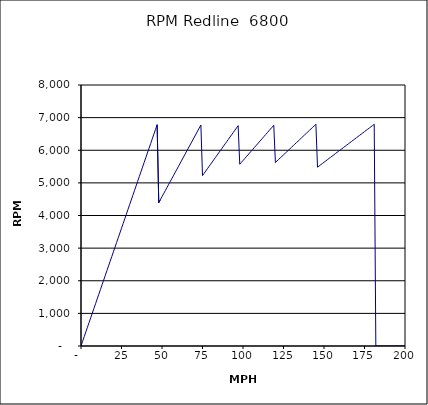
| Category | RPM Redline  6800 |
|---|---|
| 0.0 | 0 |
| 1.0 | 144.311 |
| 2.0 | 288.622 |
| 3.0 | 432.933 |
| 4.0 | 577.244 |
| 5.0 | 721.555 |
| 6.0 | 865.865 |
| 7.0 | 1010.176 |
| 8.0 | 1154.487 |
| 9.0 | 1298.798 |
| 10.0 | 1443.109 |
| 11.0 | 1587.42 |
| 12.0 | 1731.731 |
| 13.0 | 1876.042 |
| 14.0 | 2020.353 |
| 15.0 | 2164.664 |
| 16.0 | 2308.974 |
| 17.0 | 2453.285 |
| 18.0 | 2597.596 |
| 19.0 | 2741.907 |
| 20.0 | 2886.218 |
| 21.0 | 3030.529 |
| 22.0 | 3174.84 |
| 23.0 | 3319.151 |
| 24.0 | 3463.462 |
| 25.0 | 3607.773 |
| 26.0 | 3752.084 |
| 27.0 | 3896.394 |
| 28.0 | 4040.705 |
| 29.0 | 4185.016 |
| 30.0 | 4329.327 |
| 31.0 | 4473.638 |
| 32.0 | 4617.949 |
| 33.0 | 4762.26 |
| 34.0 | 4906.571 |
| 35.0 | 5050.882 |
| 36.0 | 5195.193 |
| 37.0 | 5339.503 |
| 38.0 | 5483.814 |
| 39.0 | 5628.125 |
| 40.0 | 5772.436 |
| 41.0 | 5916.747 |
| 42.0 | 6061.058 |
| 43.0 | 6205.369 |
| 44.0 | 6349.68 |
| 45.0 | 6493.991 |
| 46.0 | 6638.302 |
| 47.0 | 6782.613 |
| 48.0 | 4392.683 |
| 49.0 | 4484.197 |
| 50.0 | 4575.712 |
| 51.0 | 4667.226 |
| 52.0 | 4758.74 |
| 53.0 | 4850.254 |
| 54.0 | 4941.769 |
| 55.0 | 5033.283 |
| 56.0 | 5124.797 |
| 57.0 | 5216.311 |
| 58.0 | 5307.825 |
| 59.0 | 5399.34 |
| 60.0 | 5490.854 |
| 61.0 | 5582.368 |
| 62.0 | 5673.882 |
| 63.0 | 5765.397 |
| 64.0 | 5856.911 |
| 65.0 | 5948.425 |
| 66.0 | 6039.939 |
| 67.0 | 6131.454 |
| 68.0 | 6222.968 |
| 69.0 | 6314.482 |
| 70.0 | 6405.996 |
| 71.0 | 6497.511 |
| 72.0 | 6589.025 |
| 73.0 | 6680.539 |
| 74.0 | 6772.053 |
| 75.0 | 5222.28 |
| 76.0 | 5291.91 |
| 77.0 | 5361.54 |
| 78.0 | 5431.171 |
| 79.0 | 5500.801 |
| 80.0 | 5570.432 |
| 81.0 | 5640.062 |
| 82.0 | 5709.692 |
| 83.0 | 5779.323 |
| 84.0 | 5848.953 |
| 85.0 | 5918.584 |
| 86.0 | 5988.214 |
| 87.0 | 6057.844 |
| 88.0 | 6127.475 |
| 89.0 | 6197.105 |
| 90.0 | 6266.735 |
| 91.0 | 6336.366 |
| 92.0 | 6405.996 |
| 93.0 | 6475.627 |
| 94.0 | 6545.257 |
| 95.0 | 6614.887 |
| 96.0 | 6684.518 |
| 97.0 | 6754.148 |
| 98.0 | 5571.276 |
| 99.0 | 5628.125 |
| 100.0 | 5684.975 |
| 101.0 | 5741.825 |
| 102.0 | 5798.675 |
| 103.0 | 5855.524 |
| 104.0 | 5912.374 |
| 105.0 | 5969.224 |
| 106.0 | 6026.074 |
| 107.0 | 6082.923 |
| 108.0 | 6139.773 |
| 109.0 | 6196.623 |
| 110.0 | 6253.473 |
| 111.0 | 6310.322 |
| 112.0 | 6367.172 |
| 113.0 | 6424.022 |
| 114.0 | 6480.872 |
| 115.0 | 6537.721 |
| 116.0 | 6594.571 |
| 117.0 | 6651.421 |
| 118.0 | 6708.271 |
| 119.0 | 6765.12 |
| 120.0 | 5624.777 |
| 121.0 | 5671.65 |
| 122.0 | 5718.524 |
| 123.0 | 5765.397 |
| 124.0 | 5812.27 |
| 125.0 | 5859.143 |
| 126.0 | 5906.016 |
| 127.0 | 5952.889 |
| 128.0 | 5999.762 |
| 129.0 | 6046.636 |
| 130.0 | 6093.509 |
| 131.0 | 6140.382 |
| 132.0 | 6187.255 |
| 133.0 | 6234.128 |
| 134.0 | 6281.001 |
| 135.0 | 6327.874 |
| 136.0 | 6374.748 |
| 137.0 | 6421.621 |
| 138.0 | 6468.494 |
| 139.0 | 6515.367 |
| 140.0 | 6562.24 |
| 141.0 | 6609.113 |
| 142.0 | 6655.986 |
| 143.0 | 6702.86 |
| 144.0 | 6749.733 |
| 145.0 | 6796.606 |
| 146.0 | 5481.468 |
| 147.0 | 5519.012 |
| 148.0 | 5556.556 |
| 149.0 | 5594.101 |
| 150.0 | 5631.645 |
| 151.0 | 5669.189 |
| 152.0 | 5706.734 |
| 153.0 | 5744.278 |
| 154.0 | 5781.822 |
| 155.0 | 5819.367 |
| 156.0 | 5856.911 |
| 157.0 | 5894.455 |
| 158.0 | 5931.999 |
| 159.0 | 5969.544 |
| 160.0 | 6007.088 |
| 161.0 | 6044.632 |
| 162.0 | 6082.177 |
| 163.0 | 6119.721 |
| 164.0 | 6157.265 |
| 165.0 | 6194.81 |
| 166.0 | 6232.354 |
| 167.0 | 6269.898 |
| 168.0 | 6307.442 |
| 169.0 | 6344.987 |
| 170.0 | 6382.531 |
| 171.0 | 6420.075 |
| 172.0 | 6457.62 |
| 173.0 | 6495.164 |
| 174.0 | 6532.708 |
| 175.0 | 6570.253 |
| 176.0 | 6607.797 |
| 177.0 | 6645.341 |
| 178.0 | 6682.885 |
| 179.0 | 6720.43 |
| 180.0 | 6757.974 |
| 181.0 | 6795.518 |
| 182.0 | 0 |
| 183.0 | 0 |
| 184.0 | 0 |
| 185.0 | 0 |
| 186.0 | 0 |
| 187.0 | 0 |
| 188.0 | 0 |
| 189.0 | 0 |
| 190.0 | 0 |
| 191.0 | 0 |
| 192.0 | 0 |
| 193.0 | 0 |
| 194.0 | 0 |
| 195.0 | 0 |
| 196.0 | 0 |
| 197.0 | 0 |
| 198.0 | 0 |
| 199.0 | 0 |
| 200.0 | 0 |